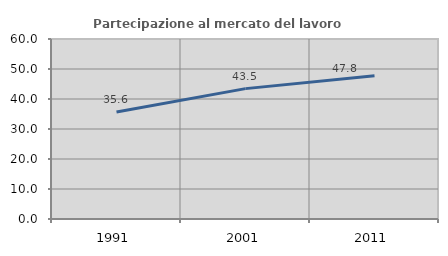
| Category | Partecipazione al mercato del lavoro  femminile |
|---|---|
| 1991.0 | 35.639 |
| 2001.0 | 43.458 |
| 2011.0 | 47.786 |